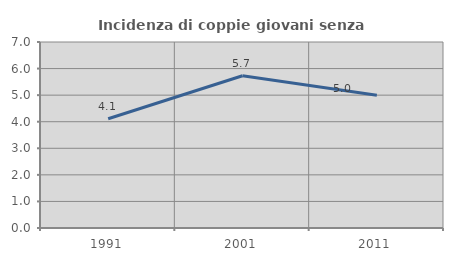
| Category | Incidenza di coppie giovani senza figli |
|---|---|
| 1991.0 | 4.112 |
| 2001.0 | 5.73 |
| 2011.0 | 5 |